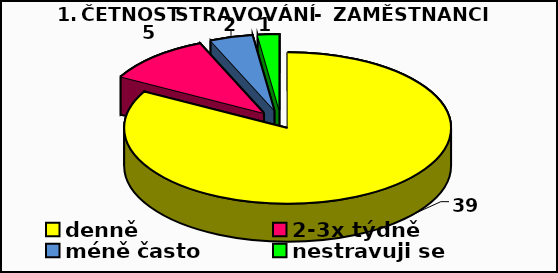
| Category | Series 0 |
|---|---|
| denně | 39 |
| 2-3x týdně | 5 |
| méně často | 2 |
| nestravuji se | 1 |